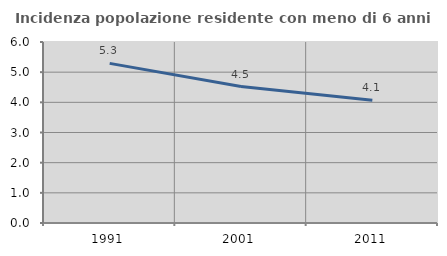
| Category | Incidenza popolazione residente con meno di 6 anni |
|---|---|
| 1991.0 | 5.291 |
| 2001.0 | 4.523 |
| 2011.0 | 4.07 |